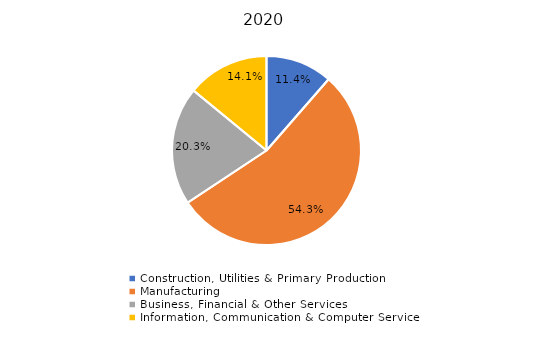
| Category | 2020 |
|---|---|
| Construction, Utilities & Primary Production  | 0.114 |
| Manufacturing  | 0.543 |
| Business, Financial & Other Services | 0.203 |
| Information, Communication & Computer Services | 0.141 |